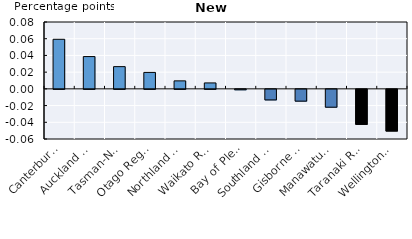
| Category | Series 0 | Series 1 | Series 2 | Series 3 |
|---|---|---|---|---|
| Canterbury Region | 0 | 0.059 | 0 | 0 |
| Auckland Region | 0 | 0.039 | 0 | 0 |
| Tasman-Nelson-Marlborough | 0 | 0.027 | 0 | 0 |
| Otago Region | 0 | 0.02 | 0 | 0 |
| Northland Region | 0 | 0.01 | 0 | 0 |
| Waikato Region | 0 | 0.007 | 0 | 0 |
| Bay of Plenty Region | 0 | -0.001 | 0 | 0 |
| Southland Region | 0 | 0 | -0.013 | 0 |
| Gisborne Region | 0 | 0 | -0.014 | 0 |
| Manawatu-Wanganui Region | 0 | 0 | -0.021 | 0 |
| Taranaki Region | -0.042 | 0 | 0 | 0 |
| Wellington Region | -0.05 | 0 | 0 | 0 |